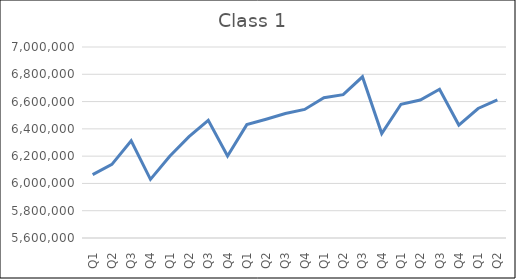
| Category | Class 1  |
|---|---|
| Q1 | 6064405 |
| Q2 | 6139443 |
| Q3 | 6312332 |
| Q4 | 6029562 |
| Q1 | 6199295 |
| Q2 | 6342839 |
| Q3 | 6462862 |
| Q4 | 6200704 |
| Q1 | 6430934 |
| Q2 | 6470578 |
| Q3 | 6512649 |
| Q4 | 6542182 |
| Q1 | 6628158 |
| Q2 | 6650686 |
| Q3 | 6781707 |
| Q4 | 6365255 |
| Q1 | 6580574 |
| Q2 | 6611387 |
| Q3 | 6690621 |
| Q4 | 6427701 |
| Q1 | 6549242 |
| Q2 | 6611773 |